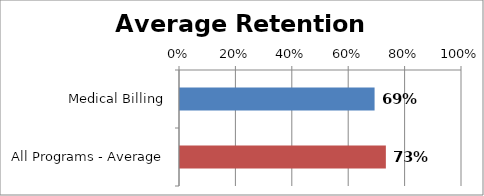
| Category | RetentionRate |
|---|---|
| Medical Billing | 0.69 |
| All Programs - Average | 0.73 |